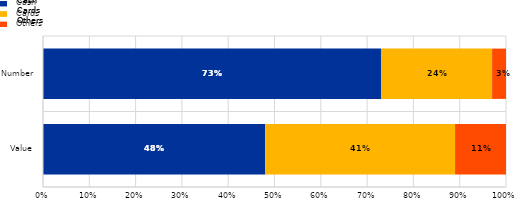
| Category | Cash | Cards | Others |
|---|---|---|---|
| Value | 0.48 | 0.41 | 0.11 |
| Number | 0.73 | 0.24 | 0.03 |